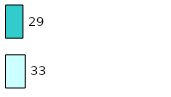
| Category | Series 0 | Series 1 |
|---|---|---|
| 0 | 33 | 29 |